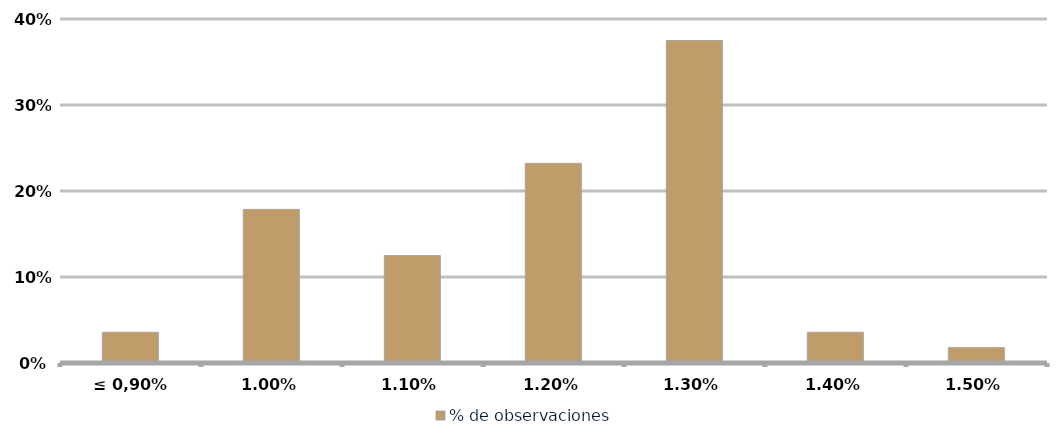
| Category | % de observaciones  |
|---|---|
| ≤ 0,90% | 0.036 |
| 1,00% | 0.179 |
| 1,10% | 0.125 |
| 1,20% | 0.232 |
| 1,30% | 0.375 |
| 1,40% | 0.036 |
| 1,50% | 0.018 |